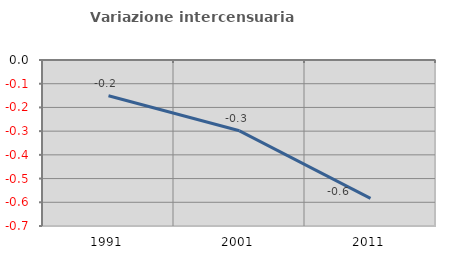
| Category | Variazione intercensuaria annua |
|---|---|
| 1991.0 | -0.15 |
| 2001.0 | -0.299 |
| 2011.0 | -0.584 |